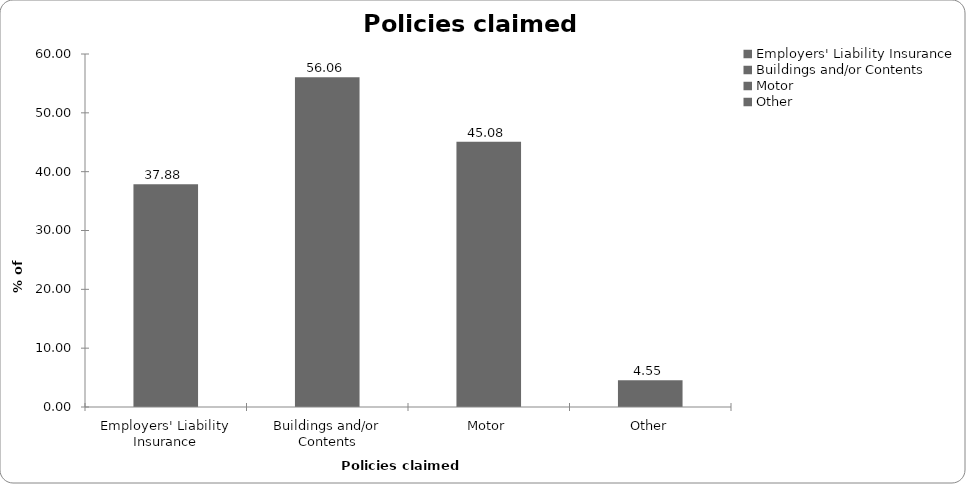
| Category | Policies claimed on |
|---|---|
| Employers' Liability Insurance | 37.879 |
| Buildings and/or Contents | 56.061 |
| Motor | 45.076 |
| Other | 4.545 |